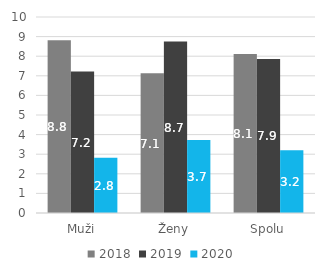
| Category | 2018 | 2019 | 2020 |
|---|---|---|---|
| 0 | 8.816 | 7.218 | 2.815 |
| 1 | 7.128 | 8.748 | 3.723 |
| 2 | 8.109 | 7.86 | 3.203 |